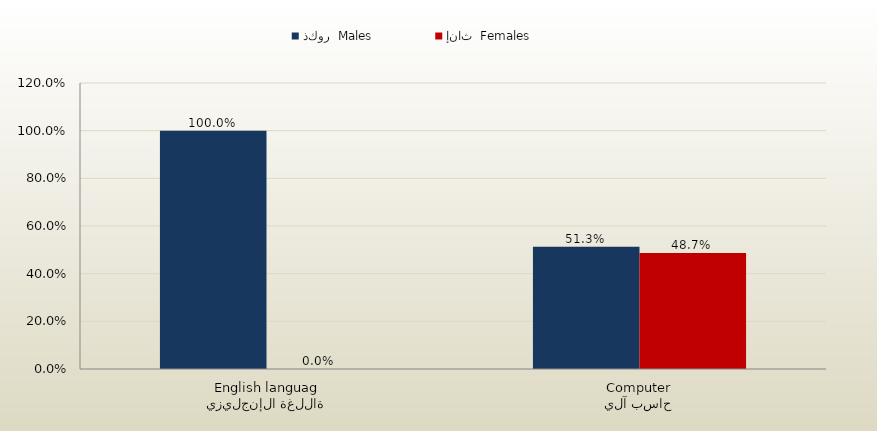
| Category | ذكور  Males | إناث  Females |
|---|---|---|
| اللغة الإنجليزية
English language | 1 | 0 |
| حاسب آلي
Computer | 0.513 | 0.487 |